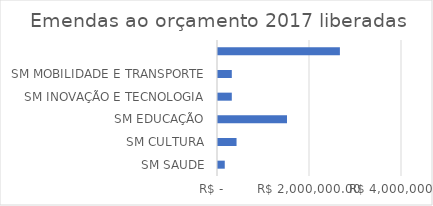
| Category | Series 0 |
|---|---|
| SM SAUDE | 147000 |
| SM CULTURA | 403000 |
| SM EDUCAÇÃO | 1500000 |
| SM INOVAÇÃO E TECNOLOGIA | 300000 |
| SM MOBILIDADE E TRANSPORTE | 300000 |